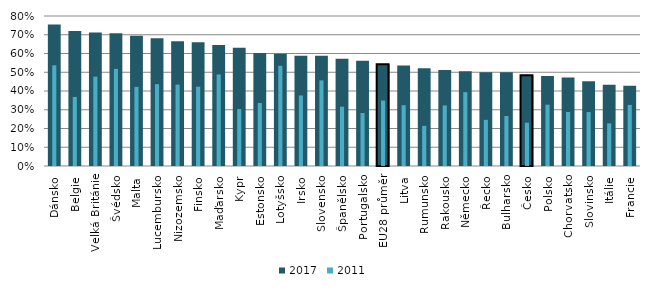
| Category | 2017 |
|---|---|
| Dánsko | 0.755 |
| Belgie | 0.72 |
| Velká Británie | 0.712 |
| Švédsko | 0.708 |
| Malta | 0.695 |
| Lucembursko | 0.681 |
| Nizozemsko | 0.666 |
| Finsko | 0.66 |
| Maďarsko | 0.646 |
| Kypr | 0.63 |
| Estonsko | 0.603 |
| Lotyšsko | 0.599 |
| Irsko | 0.589 |
| Slovensko | 0.587 |
| Španělsko | 0.572 |
| Portugalsko | 0.561 |
| EU28 průměr | 0.543 |
| Litva | 0.535 |
| Rumunsko | 0.522 |
| Rakousko | 0.512 |
| Německo | 0.506 |
| Řecko | 0.5 |
| Bulharsko | 0.499 |
| Česko | 0.483 |
| Polsko | 0.48 |
| Chorvatsko | 0.473 |
| Slovinsko | 0.452 |
| Itálie | 0.434 |
| Francie | 0.428 |